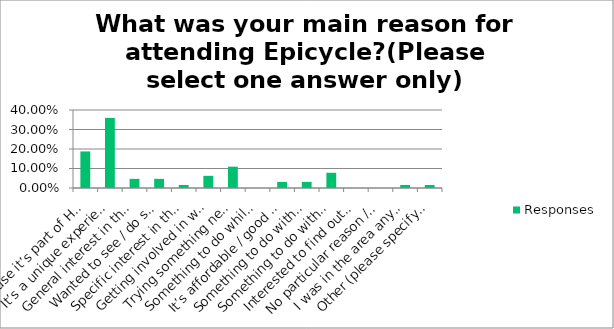
| Category | Responses |
|---|---|
| Because it’s part of Hull UK City of Culture 2017 | 0.188 |
| It’s a unique experience not to be missed | 0.359 |
| General interest in this type of event | 0.047 |
| Wanted to see / do something creative | 0.047 |
| Specific interest in the actors / artists involved (please specify which artists below) | 0.016 |
| Getting involved in what’s happening | 0.062 |
| Trying something new or different | 0.109 |
| Something to do while I’m in Hull on business | 0 |
| It’s affordable / good value | 0.031 |
| Something to do with friends / family | 0.031 |
| Something to do with the kids | 0.078 |
| Interested to find out more about Hull | 0 |
| No particular reason / someone else’s idea | 0 |
| I was in the area anyway | 0.016 |
| Other (please specify below) | 0.016 |